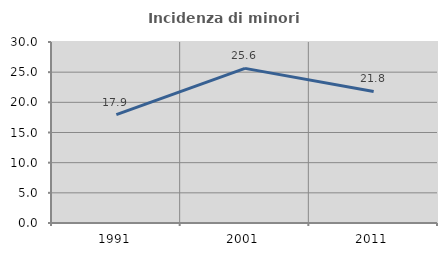
| Category | Incidenza di minori stranieri |
|---|---|
| 1991.0 | 17.949 |
| 2001.0 | 25.628 |
| 2011.0 | 21.805 |